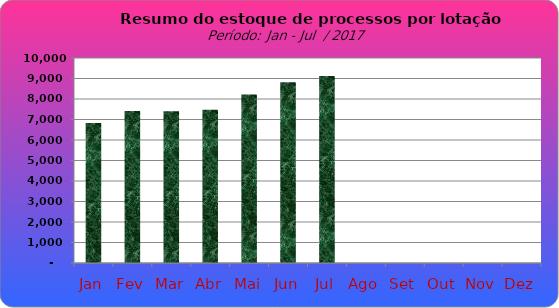
| Category | Series 0 |
|---|---|
| Jan | 6829 |
| Fev | 7414 |
| Mar | 7401 |
| Abr | 7477 |
| Mai | 8225 |
| Jun | 8821 |
| Jul | 9119 |
| Ago | 0 |
| Set | 0 |
| Out | 0 |
| Nov | 0 |
| Dez | 0 |